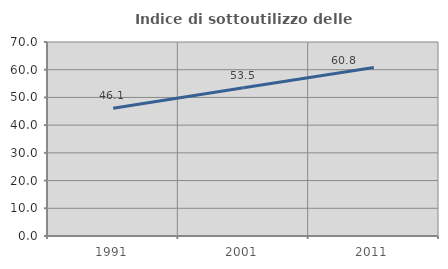
| Category | Indice di sottoutilizzo delle abitazioni  |
|---|---|
| 1991.0 | 46.118 |
| 2001.0 | 53.528 |
| 2011.0 | 60.784 |